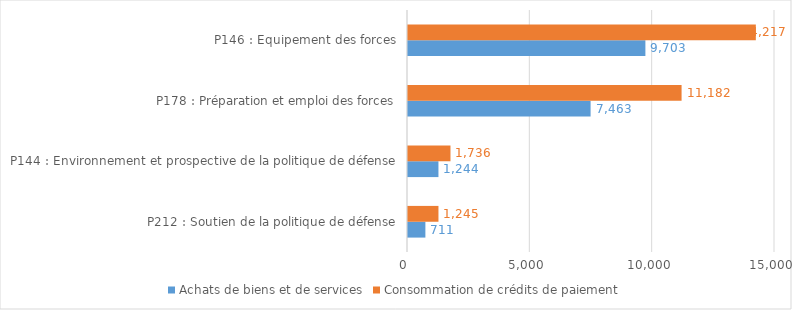
| Category | Achats de biens et de services | Consommation de crédits de paiement |
|---|---|---|
| P212 : Soutien de la politique de défense | 710.733 | 1244.889 |
| P144 : Environnement et prospective de la politique de défense | 1244.425 | 1736.165 |
| P178 : Préparation et emploi des forces | 7462.646 | 11181.646 |
| P146 : Equipement des forces | 9702.762 | 14216.693 |